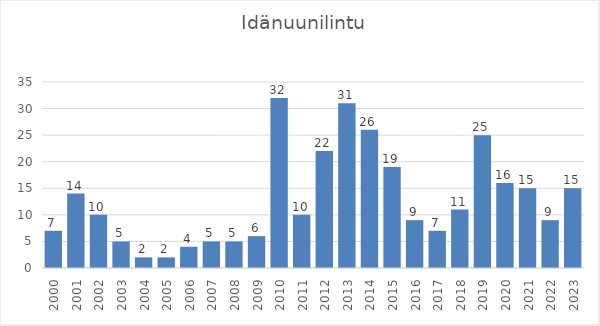
| Category | Series 0 |
|---|---|
| 2000.0 | 7 |
| 2001.0 | 14 |
| 2002.0 | 10 |
| 2003.0 | 5 |
| 2004.0 | 2 |
| 2005.0 | 2 |
| 2006.0 | 4 |
| 2007.0 | 5 |
| 2008.0 | 5 |
| 2009.0 | 6 |
| 2010.0 | 32 |
| 2011.0 | 10 |
| 2012.0 | 22 |
| 2013.0 | 31 |
| 2014.0 | 26 |
| 2015.0 | 19 |
| 2016.0 | 9 |
| 2017.0 | 7 |
| 2018.0 | 11 |
| 2019.0 | 25 |
| 2020.0 | 16 |
| 2021.0 | 15 |
| 2022.0 | 9 |
| 2023.0 | 15 |